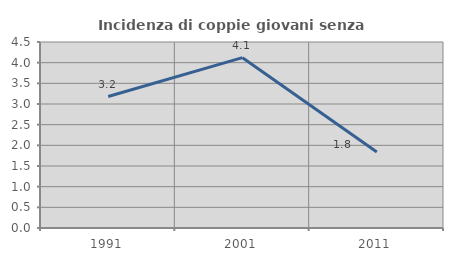
| Category | Incidenza di coppie giovani senza figli |
|---|---|
| 1991.0 | 3.181 |
| 2001.0 | 4.121 |
| 2011.0 | 1.839 |